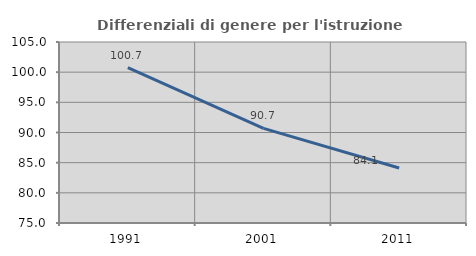
| Category | Differenziali di genere per l'istruzione superiore |
|---|---|
| 1991.0 | 100.736 |
| 2001.0 | 90.692 |
| 2011.0 | 84.117 |